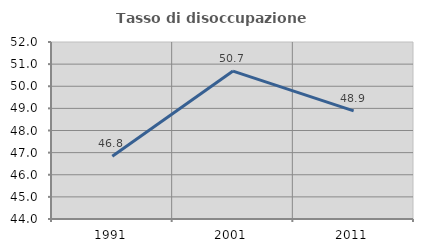
| Category | Tasso di disoccupazione giovanile  |
|---|---|
| 1991.0 | 46.835 |
| 2001.0 | 50.685 |
| 2011.0 | 48.889 |